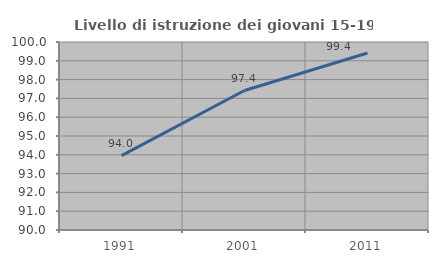
| Category | Livello di istruzione dei giovani 15-19 anni |
|---|---|
| 1991.0 | 93.953 |
| 2001.0 | 97.419 |
| 2011.0 | 99.412 |